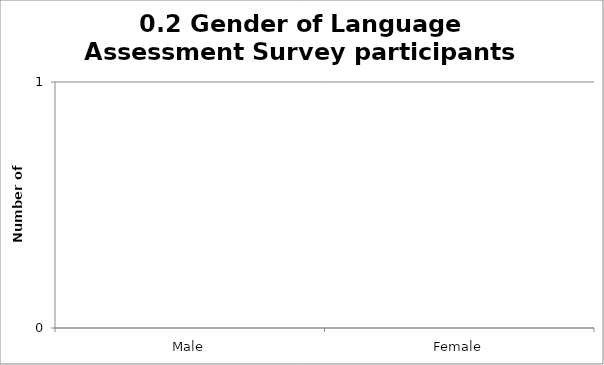
| Category | 0.2 Gender of Language Assessment Survey participants |
|---|---|
| Male | 0 |
| Female | 0 |